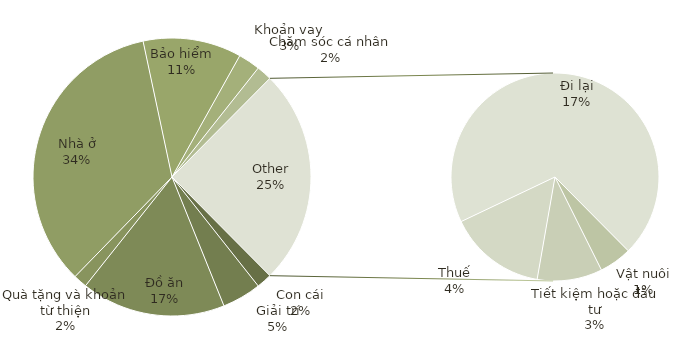
| Category | Tổng |
|---|---|
| Con cái | 140 |
| Giải trí | 358 |
| Đồ ăn | 1320 |
| Quà tặng và khoản từ thiện | 125 |
| Nhà ở | 2702 |
| Bảo hiểm | 900 |
| Khoản vay | 200 |
| Chăm sóc cá nhân | 140 |
| Vật nuôi | 100 |
| Tiết kiệm hoặc đầu tư | 200 |
| Thuế | 300 |
| Đi lại | 1375 |